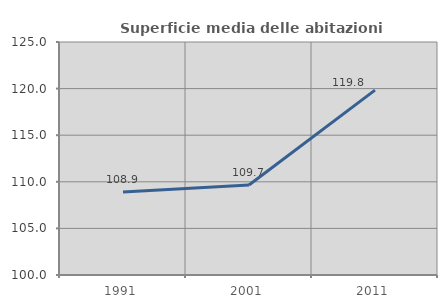
| Category | Superficie media delle abitazioni occupate |
|---|---|
| 1991.0 | 108.894 |
| 2001.0 | 109.657 |
| 2011.0 | 119.837 |